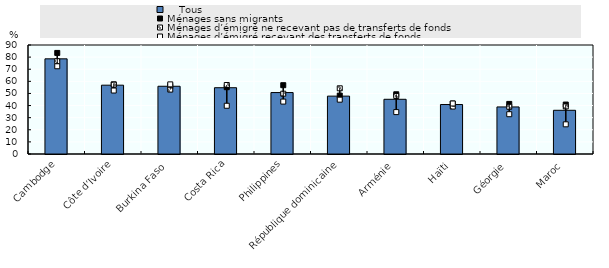
| Category |     Tous |
|---|---|
| Cambodge | 78.58 |
| Côte d’Ivoire | 56.82 |
| Burkina Faso | 55.94 |
| Costa Rica | 54.74 |
| Philippines | 50.73 |
| République dominicaine | 47.78 |
| Arménie | 45.17 |
| Haïti | 40.85 |
| Géorgie | 38.87 |
| Maroc | 36.09 |